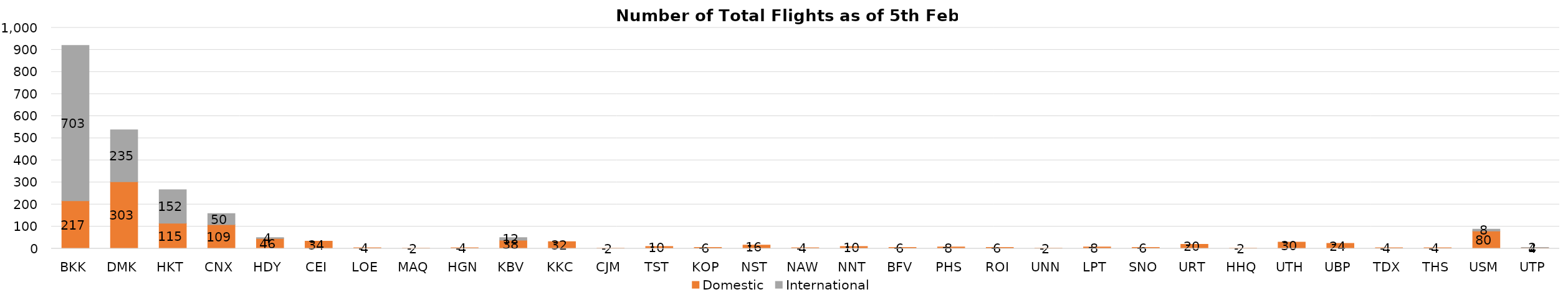
| Category | Domestic | International |
|---|---|---|
| BKK | 217 | 703 |
| DMK | 303 | 235 |
| HKT | 115 | 152 |
| CNX | 109 | 50 |
| HDY | 46 | 4 |
| CEI | 34 | 0 |
| LOE | 4 | 0 |
| MAQ | 2 | 0 |
| HGN | 4 | 0 |
| KBV | 38 | 12 |
| KKC | 32 | 0 |
| CJM | 2 | 0 |
| TST | 10 | 0 |
| KOP | 6 | 0 |
| NST | 16 | 0 |
| NAW | 4 | 0 |
| NNT | 10 | 0 |
| BFV | 6 | 0 |
| PHS | 8 | 0 |
| ROI | 6 | 0 |
| UNN | 2 | 0 |
| LPT | 8 | 0 |
| SNO | 6 | 0 |
| URT | 20 | 0 |
| HHQ | 2 | 0 |
| UTH | 30 | 0 |
| UBP | 24 | 0 |
| TDX | 4 | 0 |
| THS | 4 | 0 |
| USM | 80 | 8 |
| UTP | 4 | 2 |